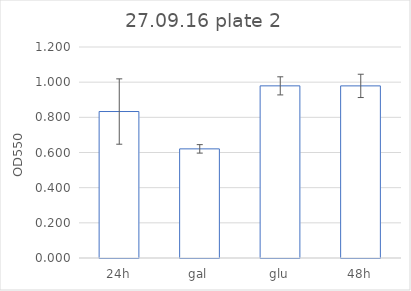
| Category | Series 0 |
|---|---|
| 24h | 0.833 |
| gal | 0.621 |
| glu | 0.979 |
| 48h | 0.979 |